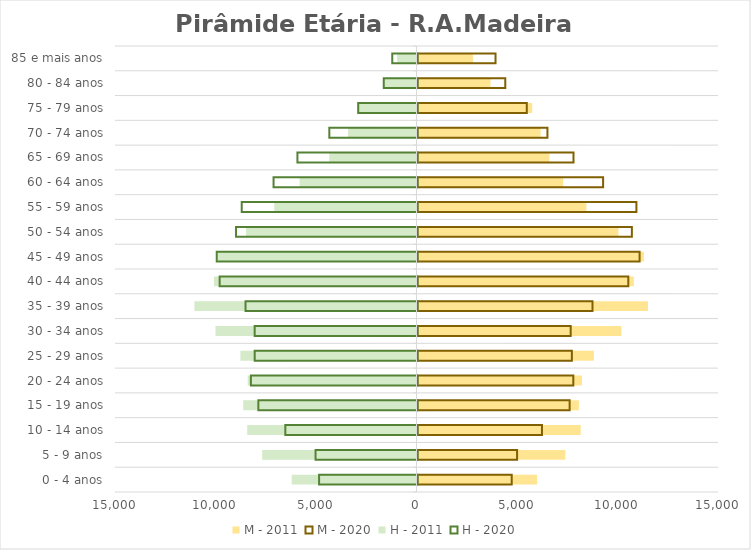
| Category | M - 2011 | M - 2020 | H - 2011 | H - 2020 |
|---|---|---|---|---|
| 0 - 4 anos | 5950 | 4687 | -6208 | -4896 |
| 5 - 9 anos | 7352 | 4954 | -7678 | -5072 |
| 10 - 14 anos | 8121 | 6192 | -8422 | -6576 |
| 15 - 19 anos | 8029 | 7569 | -8621 | -7918 |
| 20 - 24 anos | 8183 | 7752 | -8396 | -8289 |
| 25 - 29 anos | 8777 | 7680 | -8762 | -8100 |
| 30 - 34 anos | 10140 | 7621 | -10001 | -8101 |
| 35 - 39 anos | 11466 | 8706 | -11048 | -8556 |
| 40 - 44 anos | 10764 | 10488 | -10073 | -9843 |
| 45 - 49 anos | 11264 | 11049 | -9899 | -9988 |
| 50 - 54 anos | 9997 | 10665 | -8477 | -9028 |
| 55 - 59 anos | 8404 | 10891 | -7080 | -8745 |
| 60 - 64 anos | 7247 | 9234 | -5814 | -7161 |
| 65 - 69 anos | 6556 | 7761 | -4337 | -5974 |
| 70 - 74 anos | 6129 | 6464 | -3403 | -4387 |
| 75 - 79 anos | 5709 | 5437 | -2935 | -2950 |
| 80 - 84 anos | 3634 | 4367 | -1635 | -1682 |
| 85 e mais anos | 2760 | 3882 | -965 | -1258 |